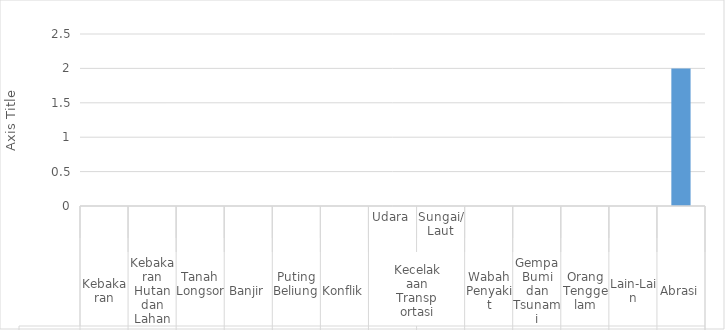
| Category | Series 0 |
|---|---|
| 0 | 0 |
| 1 | 0 |
| 2 | 0 |
| 3 | 0 |
| 4 | 0 |
| 5 | 0 |
| 6 | 0 |
| 7 | 0 |
| 8 | 0 |
| 9 | 0 |
| 10 | 0 |
| 11 | 0 |
| 12 | 2 |